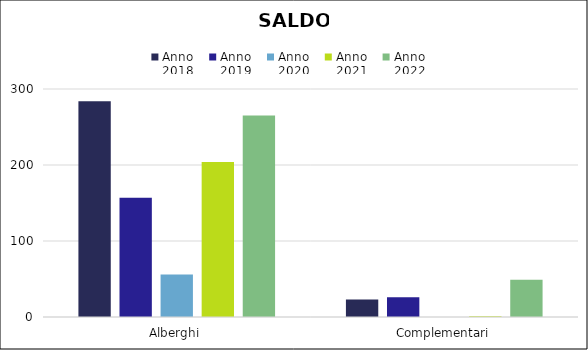
| Category | Anno
2018 | Anno
2019 | Anno
2020 | Anno
2021 | Anno
2022 |
|---|---|---|---|---|---|
| Alberghi | 284 | 157 | 56 | 204 | 265 |
| Complementari | 23 | 26 | -8 | 1 | 49 |